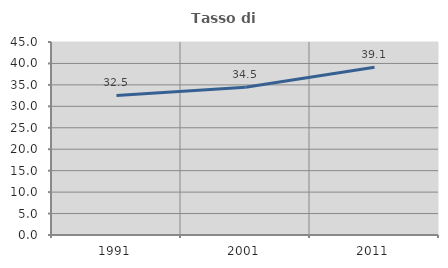
| Category | Tasso di occupazione   |
|---|---|
| 1991.0 | 32.537 |
| 2001.0 | 34.452 |
| 2011.0 | 39.126 |